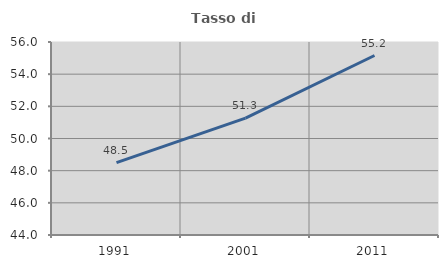
| Category | Tasso di occupazione   |
|---|---|
| 1991.0 | 48.502 |
| 2001.0 | 51.264 |
| 2011.0 | 55.159 |